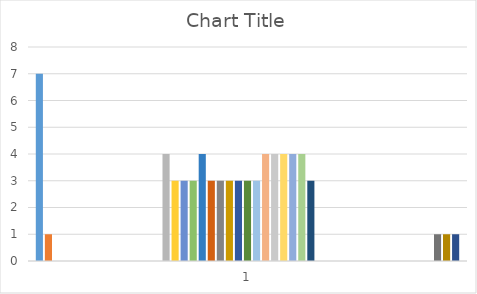
| Category | Series 0 | Series 1 | Series 2 | Series 3 | Series 4 | Series 5 | Series 6 | Series 7 | Series 8 | Series 9 | Series 10 | Series 11 | Series 12 | Series 13 | Series 14 | Series 15 | Series 16 | Series 17 | Series 18 | Series 19 | Series 20 | Series 21 | Series 22 | Series 23 | Series 24 | Series 25 | Series 26 | Series 27 | Series 28 | Series 29 | Series 30 | Series 31 | Series 32 | Series 33 | Series 34 | Series 35 | Series 36 | Series 37 | Series 38 | Series 39 | Series 40 | Series 41 | Series 42 | Series 43 | Series 44 | Series 45 | Series 46 |
|---|---|---|---|---|---|---|---|---|---|---|---|---|---|---|---|---|---|---|---|---|---|---|---|---|---|---|---|---|---|---|---|---|---|---|---|---|---|---|---|---|---|---|---|---|---|---|---|
| 0 | 7 | 1 | 0 | 0 | 0 | 0 | 0 | 0 | 0 | 0 | 0 | 0 | 0 | 0 | 4 | 3 | 3 | 3 | 4 | 3 | 3 | 3 | 3 | 3 | 3 | 4 | 4 | 4 | 4 | 4 | 3 | 0 | 0 | 0 | 0 | 0 | 0 | 0 | 0 | 0 | 0 | 0 | 0 | 0 | 1 | 1 | 1 |